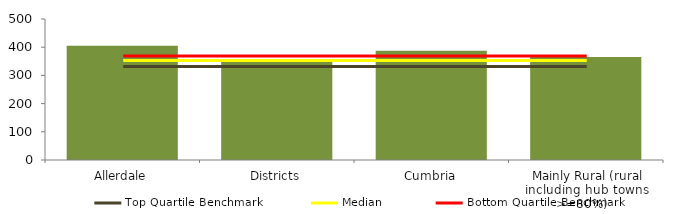
| Category | Block Data |
|---|---|
| Allerdale | 405.5 |
| Districts | 349.54 |
| Cumbria | 387.333 |
|  Mainly Rural (rural including hub towns >=80%)   | 365.53 |